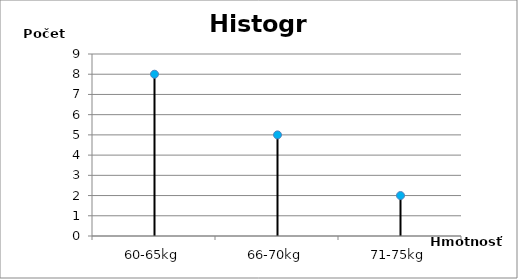
| Category | počet |
|---|---|
| 60-65kg | 8 |
| 66-70kg | 5 |
| 71-75kg | 2 |